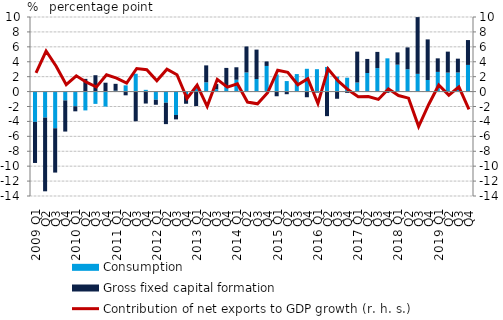
| Category | Consumption | Gross fixed capital formation |
|---|---|---|
| 2009 Q1 | -4.06 | -5.511 |
| Q2 | -3.49 | -9.88 |
| Q3 | -4.919 | -5.94 |
| Q4 | -1.186 | -4.173 |
| 2010 Q1 | -1.971 | -0.676 |
| Q2 | -2.524 | 1.704 |
| Q3 | -1.65 | 2.194 |
| Q4 | -2.013 | 1.19 |
| 2011 Q1 | 0.117 | 0.923 |
| Q2 | 0.835 | -0.501 |
| Q3 | 2.392 | -3.979 |
| Q4 | 0.234 | -1.602 |
| 2012 Q1 | -1.1 | -0.667 |
| Q2 | -1.494 | -2.869 |
| Q3 | -3.135 | -0.591 |
| Q4 | -0.362 | -1.27 |
| 2013 Q1 | 0.692 | -1.943 |
| Q2 | 1.247 | 2.266 |
| Q3 | 0.319 | 0.693 |
| Q4 | 0.633 | 2.542 |
| 2014 Q1 | 1.591 | 1.668 |
| Q2 | 2.567 | 3.485 |
| Q3 | 1.689 | 3.939 |
| Q4 | 3.437 | 0.607 |
| 2015 Q1 | 2.298 | -0.627 |
| Q2 | 1.41 | -0.353 |
| Q3 | 2.348 | -0.007 |
| Q4 | 3.055 | -0.759 |
| 2016 Q1 | 3.003 | -0.134 |
| Q2 | 3.303 | -3.294 |
| Q3 | 2.004 | -0.962 |
| Q4 | 1.861 | -0.17 |
| 2017 Q1 | 1.215 | 4.143 |
| Q2 | 2.495 | 1.881 |
| Q3 | 3.149 | 2.172 |
| Q4 | 4.457 | -0.162 |
| 2018 Q1 | 3.605 | 1.652 |
| Q2 | 2.993 | 2.931 |
| Q3 | 2.376 | 7.608 |
| Q4 | 1.556 | 5.441 |
| 2019 Q1 | 2.641 | 1.816 |
| Q2 | 2.543 | 2.813 |
| Q3 | 2.559 | 1.856 |
| Q4 | 3.574 | 3.335 |